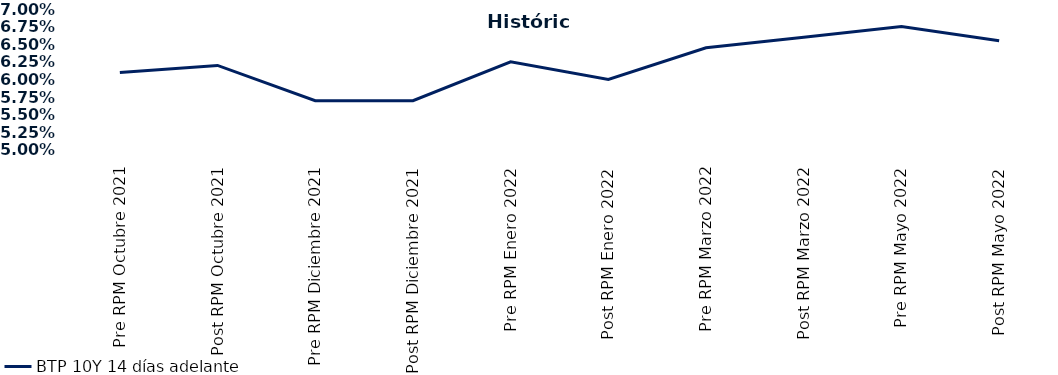
| Category | BTP 10Y 14 días adelante |
|---|---|
| Pre RPM Octubre 2021 | 0.061 |
| Post RPM Octubre 2021 | 0.062 |
| Pre RPM Diciembre 2021 | 0.057 |
| Post RPM Diciembre 2021 | 0.057 |
| Pre RPM Enero 2022 | 0.062 |
| Post RPM Enero 2022 | 0.06 |
| Pre RPM Marzo 2022 | 0.064 |
| Post RPM Marzo 2022 | 0.066 |
| Pre RPM Mayo 2022 | 0.068 |
| Post RPM Mayo 2022 | 0.066 |